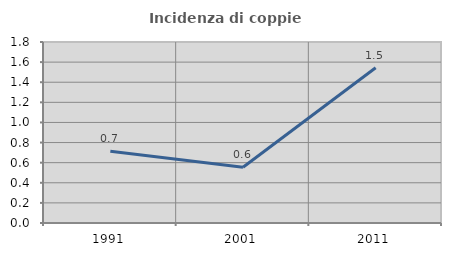
| Category | Incidenza di coppie miste |
|---|---|
| 1991.0 | 0.714 |
| 2001.0 | 0.555 |
| 2011.0 | 1.544 |